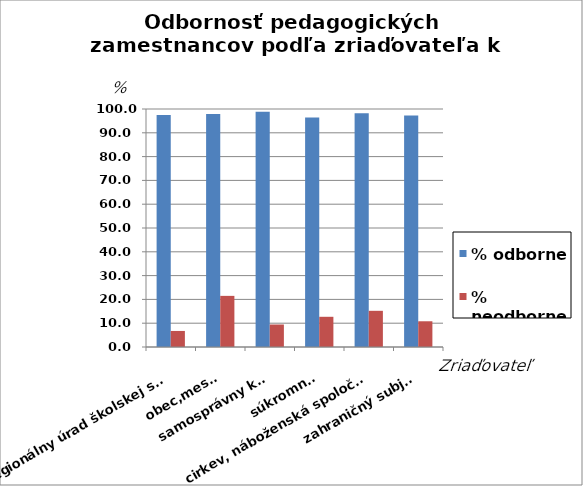
| Category | % odborne | % neodborne |
|---|---|---|
| regionálny úrad školskej správy | 97.529 | 6.743 |
| obec,mesto | 97.901 | 21.483 |
| samosprávny kraj | 98.851 | 9.452 |
| súkromník | 96.422 | 12.692 |
| cirkev, náboženská spoločnosť | 98.215 | 15.203 |
| zahraničný subjekt | 97.297 | 10.811 |